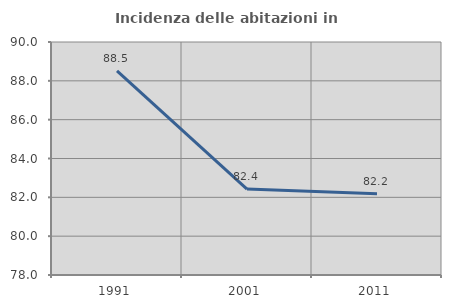
| Category | Incidenza delle abitazioni in proprietà  |
|---|---|
| 1991.0 | 88.509 |
| 2001.0 | 82.424 |
| 2011.0 | 82.188 |